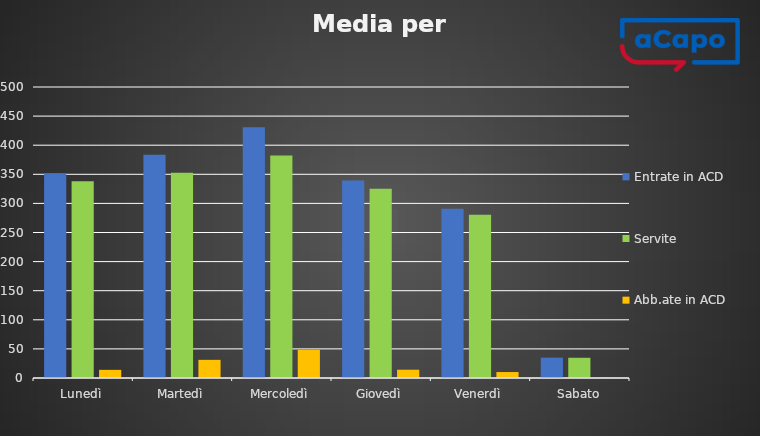
| Category | Entrate in ACD | Servite | Abb.ate in ACD |
|---|---|---|---|
| Lunedì | 352 | 338 | 14 |
| Martedì | 383.8 | 352.6 | 31.2 |
| Mercoledì | 430.75 | 382.25 | 48.5 |
| Giovedì | 339.5 | 325.25 | 14.25 |
| Venerdì | 290.75 | 280.5 | 10.25 |
| Sabato | 35 | 34.75 | 0.25 |